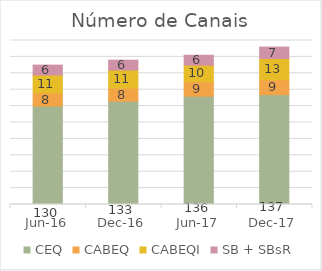
| Category | CEQ | CABEQ | CABEQI | SB + SBsR |
|---|---|---|---|---|
| 2016-06-01 | 130 | 8 | 11 | 6 |
| 2016-12-01 | 133 | 8 | 11 | 6 |
| 2017-06-01 | 136 | 9 | 10 | 6 |
| 2017-12-01 | 137 | 9 | 13 | 7 |